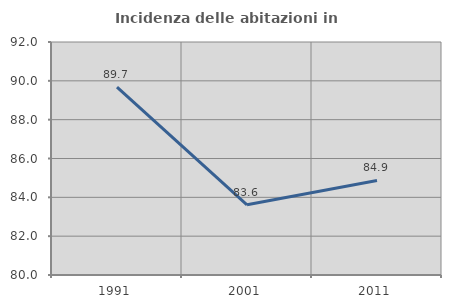
| Category | Incidenza delle abitazioni in proprietà  |
|---|---|
| 1991.0 | 89.674 |
| 2001.0 | 83.616 |
| 2011.0 | 84.868 |